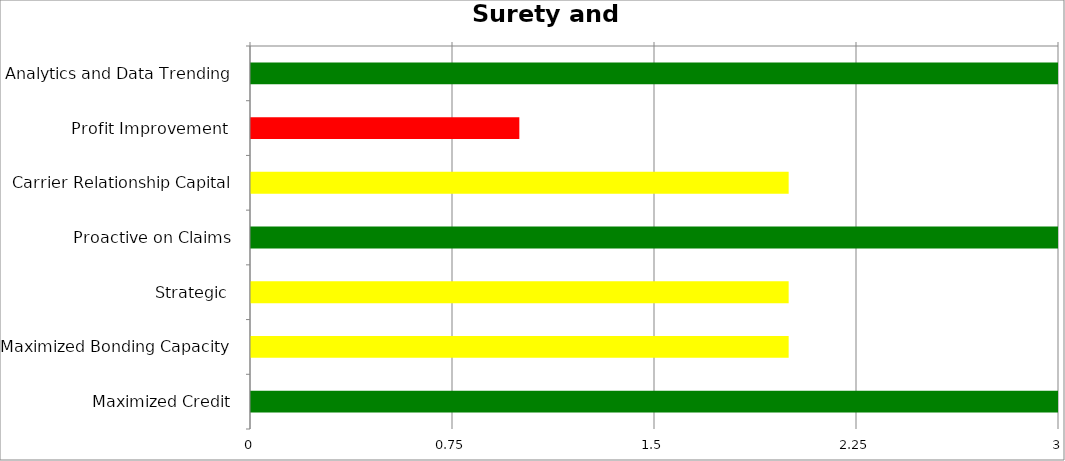
| Category | Low | Medium | High |
|---|---|---|---|
| Analytics and Data Trending | 3 | 0 | 0 |
| Profit Improvement  | 0 | 0 | 1 |
| Carrier Relationship Capital | 0 | 2 | 0 |
| Proactive on Claims | 3 | 0 | 0 |
| Strategic  | 0 | 2 | 0 |
| Maximized Bonding Capacity | 0 | 2 | 0 |
| Maximized Credit | 3 | 0 | 0 |